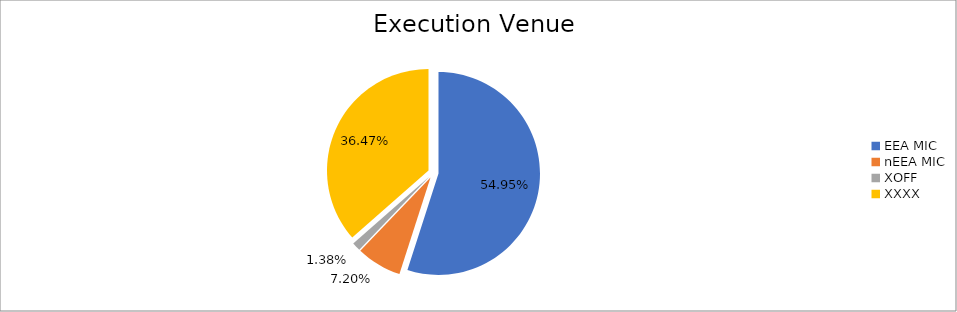
| Category | Series 0 |
|---|---|
| EEA MIC | 6498363.654 |
| nEEA MIC | 851292.282 |
| XOFF | 163009.11 |
| XXXX | 4312444.687 |